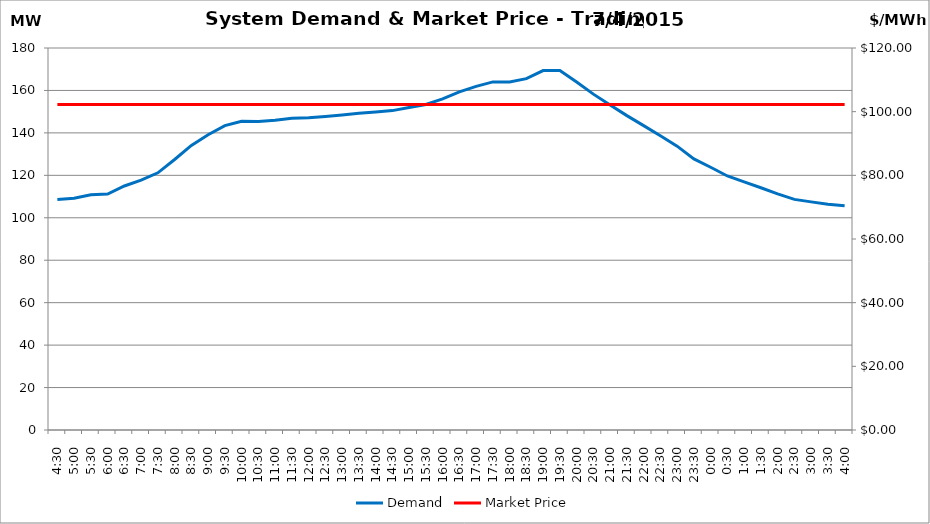
| Category | Demand |
|---|---|
| 0.1875 | 108.59 |
| 0.20833333333333334 | 109.19 |
| 0.22916666666666666 | 110.87 |
| 0.25 | 111.2 |
| 0.270833333333333 | 114.99 |
| 0.291666666666667 | 117.73 |
| 0.3125 | 121.19 |
| 0.333333333333333 | 127.46 |
| 0.354166666666667 | 134.08 |
| 0.375 | 139.14 |
| 0.395833333333333 | 143.4 |
| 0.416666666666667 | 145.47 |
| 0.4375 | 145.38 |
| 0.458333333333333 | 145.99 |
| 0.479166666666667 | 146.86 |
| 0.5 | 147.08 |
| 0.520833333333333 | 147.68 |
| 0.541666666666667 | 148.38 |
| 0.5625 | 149.2 |
| 0.583333333333333 | 149.81 |
| 0.604166666666667 | 150.5 |
| 0.625 | 151.97 |
| 0.645833333333334 | 153.39 |
| 0.666666666666667 | 156.01 |
| 0.6875 | 159.31 |
| 0.708333333333334 | 161.9 |
| 0.729166666666667 | 164.03 |
| 0.75 | 164.03 |
| 0.770833333333334 | 165.55 |
| 0.791666666666667 | 169.36 |
| 0.8125 | 169.39 |
| 0.833333333333334 | 163.97 |
| 0.854166666666667 | 158.26 |
| 0.875 | 153.14 |
| 0.895833333333334 | 148.13 |
| 0.916666666666667 | 143.42 |
| 0.9375 | 138.68 |
| 0.958333333333334 | 133.74 |
| 0.979166666666667 | 127.72 |
| 1900-01-01 | 123.8 |
| 1900-01-01 00:30:00 | 119.69 |
| 1900-01-01 01:00:00 | 116.92 |
| 1900-01-01 01:30:00 | 114.16 |
| 1900-01-01 02:00:00 | 111.25 |
| 1900-01-01 02:30:00 | 108.66 |
| 1900-01-01 03:00:00 | 107.49 |
| 1900-01-01 03:30:00 | 106.42 |
| 1900-01-01 04:00:00 | 105.62 |